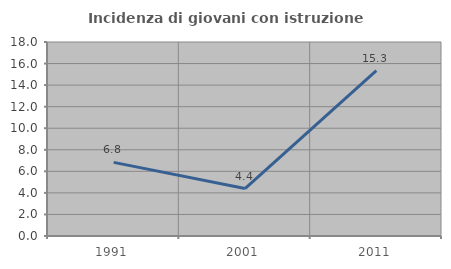
| Category | Incidenza di giovani con istruzione universitaria |
|---|---|
| 1991.0 | 6.834 |
| 2001.0 | 4.405 |
| 2011.0 | 15.333 |